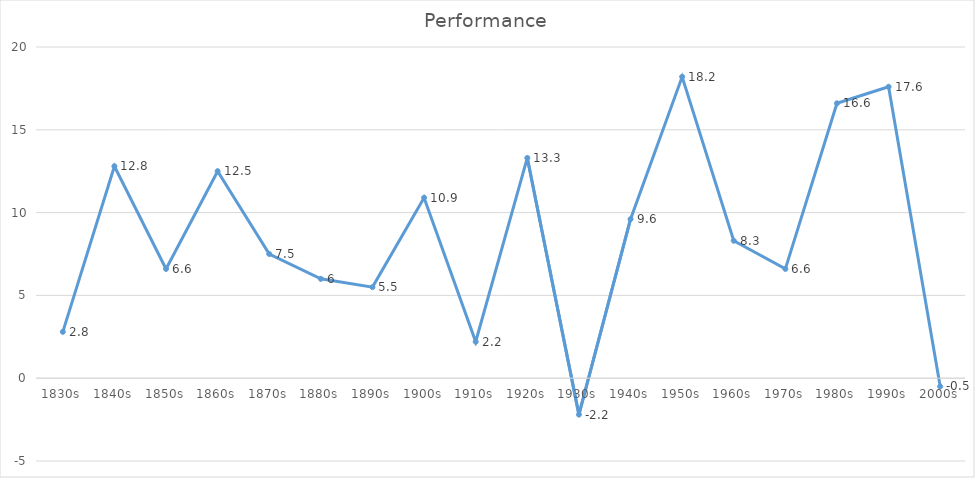
| Category | Performance |
|---|---|
| 1830s | 2.8 |
| 1840s | 12.8 |
| 1850s | 6.6 |
| 1860s | 12.5 |
| 1870s | 7.5 |
| 1880s | 6 |
| 1890s | 5.5 |
| 1900s | 10.9 |
| 1910s | 2.2 |
| 1920s | 13.3 |
| 1930s | -2.2 |
| 1940s | 9.6 |
| 1950s | 18.2 |
| 1960s | 8.3 |
| 1970s | 6.6 |
| 1980s | 16.6 |
| 1990s | 17.6 |
| 2000s | -0.5 |